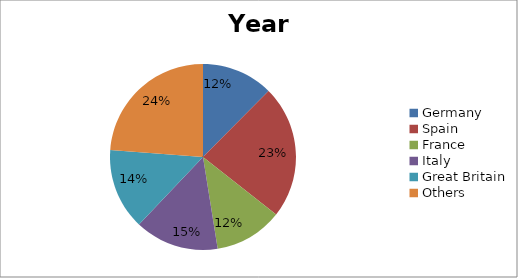
| Category | 2014 |
|---|---|
| Germany | 110.6 |
| Spain | 205.9 |
| France | 105.6 |
| Italy | 129.9 |
| Great Britain | 125.6 |
| Others | 211.5 |